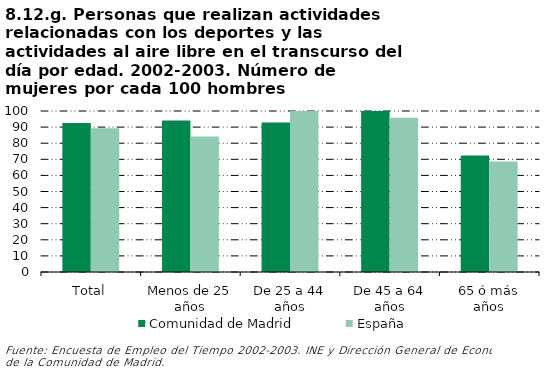
| Category | Comunidad de Madrid | España |
|---|---|---|
| Total | 92.611 | 89.227 |
| Menos de 25 años | 94.118 | 84.086 |
| De 25 a 44 años | 92.899 | 100 |
| De 45 a 64 años | 100.24 | 95.735 |
| 65 ó más años | 72.399 | 68.634 |